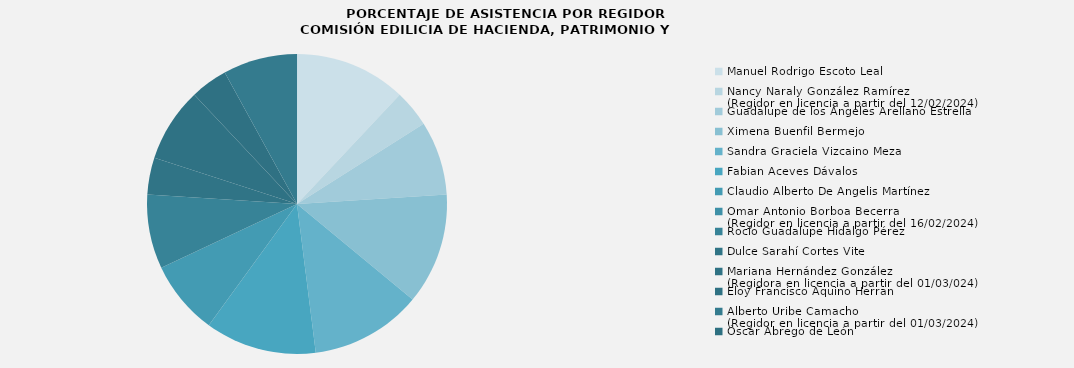
| Category | Series 0 |
|---|---|
| Manuel Rodrigo Escoto Leal | 100 |
| Nancy Naraly González Ramírez
(Regidor en licencia a partir del 12/02/2024) | 33.333 |
| Guadalupe de los Ángeles Arellano Estrella | 66.667 |
| Ximena Buenfil Bermejo | 100 |
| Sandra Graciela Vizcaino Meza | 100 |
| Fabian Aceves Dávalos | 100 |
| Claudio Alberto De Angelis Martínez | 66.667 |
| Omar Antonio Borboa Becerra
(Regidor en licencia a partir del 16/02/2024) | 0 |
| Rocío Guadalupe Hidalgo Pérez | 66.667 |
| Dulce Sarahí Cortes Vite | 33.333 |
| Mariana Hernández González
(Regidora en licencia a partir del 01/03/024) | 66.667 |
| Eloy Francisco Aquino Herran | 33.333 |
| Alberto Uribe Camacho
(Regidor en licencia a partir del 01/03/2024) | 66.667 |
| Óscar Ábrego de León | 0 |